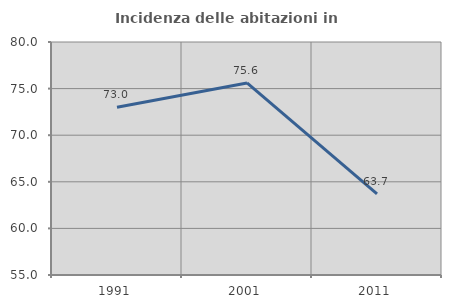
| Category | Incidenza delle abitazioni in proprietà  |
|---|---|
| 1991.0 | 72.996 |
| 2001.0 | 75.61 |
| 2011.0 | 63.707 |